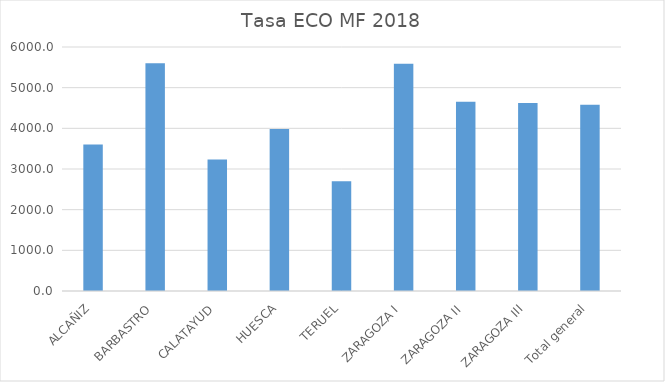
| Category | 1sem2018 |
|---|---|
| ALCAÑIZ | 3604.391 |
| BARBASTRO | 5600.308 |
| CALATAYUD | 3232.431 |
| HUESCA | 3985.729 |
| TERUEL | 2699.728 |
| ZARAGOZA I | 5590.4 |
| ZARAGOZA II | 4651.993 |
| ZARAGOZA III | 4619.936 |
| Total general | 4580.599 |